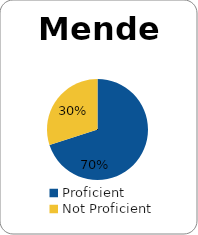
| Category | Series 0 |
|---|---|
| Proficient | 0.7 |
| Not Proficient | 0.3 |